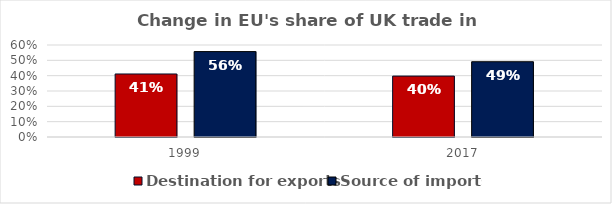
| Category | Destination for exports | Source of imports |
|---|---|---|
| 1999.0 | 0.411 | 0.557 |
| 2017.0 | 0.397 | 0.491 |